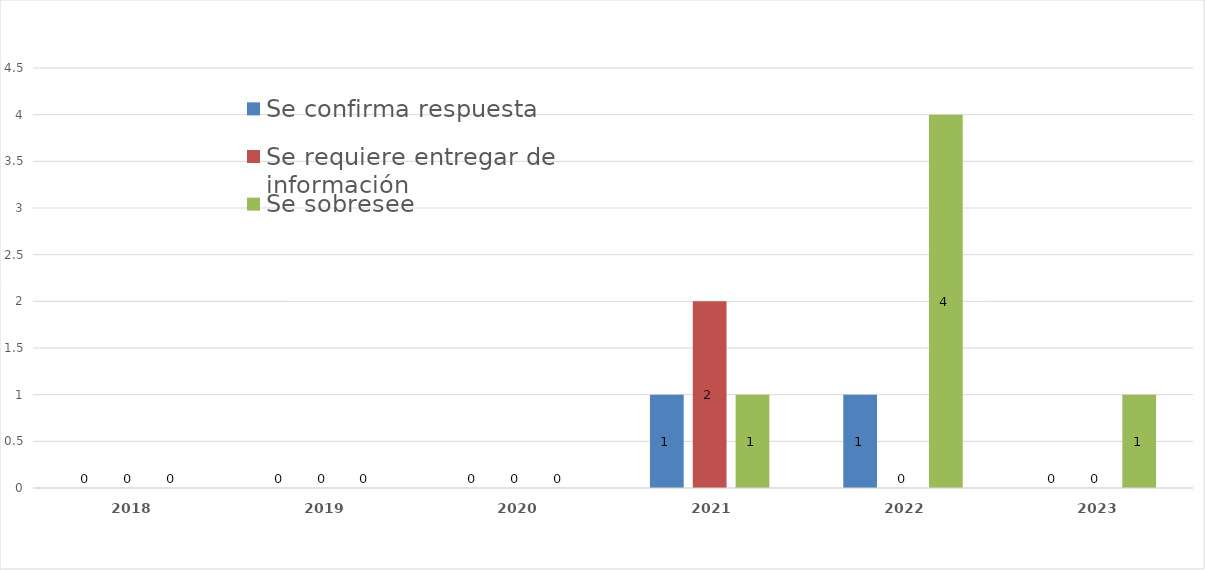
| Category | Se confirma respuesta | Se requiere entregar de información  | Se sobresee  |
|---|---|---|---|
| 2018.0 | 0 | 0 | 0 |
| 2019.0 | 0 | 0 | 0 |
| 2020.0 | 0 | 0 | 0 |
| 2021.0 | 1 | 2 | 1 |
| 2022.0 | 1 | 0 | 4 |
| 2023.0 | 0 | 0 | 1 |